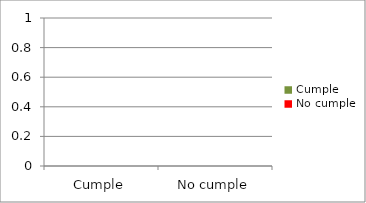
| Category | Series 0 |
|---|---|
| Cumple | 0 |
| No cumple | 0 |